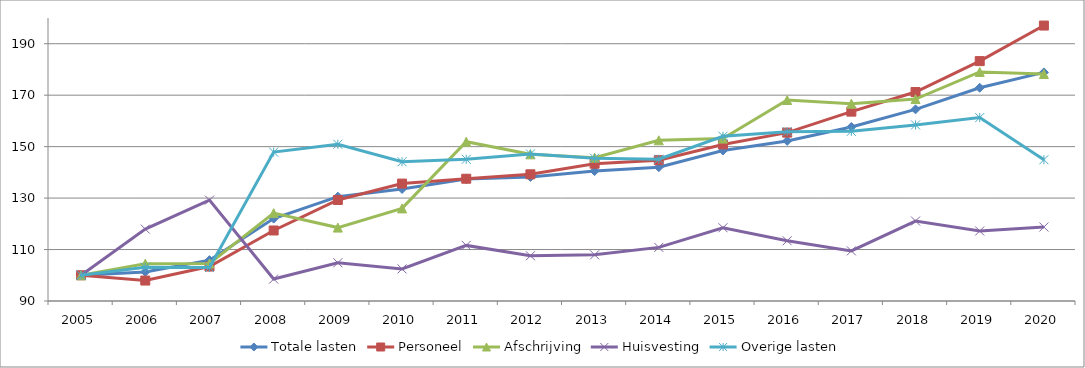
| Category | Totale lasten | Personeel | Afschrijving | Huisvesting | Overige lasten |
|---|---|---|---|---|---|
| 2005.0 | 100 | 100 | 100 | 100 | 100 |
| 2006.0 | 101.301 | 97.949 | 104.506 | 117.948 | 103.111 |
| 2007.0 | 105.876 | 103.387 | 104.584 | 129.213 | 102.991 |
| 2008.0 | 122.03 | 117.407 | 124.16 | 98.531 | 147.864 |
| 2009.0 | 130.557 | 129.274 | 118.537 | 104.856 | 150.913 |
| 2010.0 | 133.535 | 135.64 | 125.999 | 102.477 | 144.12 |
| 2011.0 | 137.387 | 137.525 | 151.917 | 111.609 | 145.079 |
| 2012.0 | 138.226 | 139.248 | 147.003 | 107.587 | 147.164 |
| 2013.0 | 140.495 | 143.356 | 145.723 | 107.943 | 145.466 |
| 2014.0 | 142 | 144.734 | 152.46 | 110.841 | 145.114 |
| 2015.0 | 148.497 | 150.859 | 153.115 | 118.473 | 154.039 |
| 2016.0 | 152.229 | 155.452 | 168.123 | 113.419 | 155.827 |
| 2017.0 | 157.659 | 163.599 | 166.664 | 109.487 | 155.956 |
| 2018.0 | 164.501 | 171.221 | 168.495 | 121.086 | 158.442 |
| 2019.0 | 172.878 | 183.247 | 179.033 | 117.22 | 161.294 |
| 2020.0 | 178.854 | 197.066 | 178.239 | 118.759 | 144.921 |